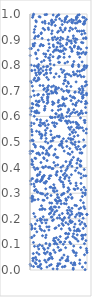
| Category | Series 0 |
|---|---|
| 0.001 | 0.865 |
| 0.002 | 0.464 |
| 0.003 | 0.022 |
| 0.004 | 0.838 |
| 0.005 | 0.455 |
| 0.006 | 0.632 |
| 0.007 | 0.348 |
| 0.008 | 0.607 |
| 0.009 | 0.504 |
| 0.01 | 0.737 |
| 0.011 | 0.465 |
| 0.012 | 0.677 |
| 0.013 | 0.016 |
| 0.014 | 0.178 |
| 0.015 | 0.281 |
| 0.016 | 0.564 |
| 0.017 | 0.335 |
| 0.018 | 0.8 |
| 0.019 | 0.632 |
| 0.02 | 0.127 |
| 0.021 | 0.575 |
| 0.022 | 0.62 |
| 0.023 | 0.733 |
| 0.024 | 0.865 |
| 0.025 | 0.413 |
| 0.026 | 0.78 |
| 0.027 | 0.16 |
| 0.028 | 0.548 |
| 0.029 | 0.356 |
| 0.03 | 0.43 |
| 0.031 | 0.172 |
| 0.032 | 0.779 |
| 0.033 | 0.268 |
| 0.034 | 0.127 |
| 0.035 | 0.54 |
| 0.036 | 0.527 |
| 0.037 | 0.164 |
| 0.038 | 0.65 |
| 0.039 | 0.289 |
| 0.04 | 0.508 |
| 0.041 | 0.718 |
| 0.042 | 0.278 |
| 0.043 | 0.634 |
| 0.044 | 0.424 |
| 0.045 | 0.987 |
| 0.046 | 0.357 |
| 0.047 | 0.412 |
| 0.048 | 0.464 |
| 0.049 | 0.045 |
| 0.05 | 0.286 |
| 0.051 | 0.036 |
| 0.052 | 0.648 |
| 0.053 | 0.883 |
| 0.054 | 0.993 |
| 0.055 | 0.505 |
| 0.056 | 0.274 |
| 0.057 | 0.875 |
| 0.058 | 0.064 |
| 0.059 | 0.7 |
| 0.06 | 0.107 |
| 0.061 | 0.014 |
| 0.062 | 0.877 |
| 0.063 | 0.999 |
| 0.064 | 0.045 |
| 0.065 | 0.221 |
| 0.066 | 0.491 |
| 0.067 | 0.743 |
| 0.068 | 0.336 |
| 0.069 | 0.401 |
| 0.07 | 0.572 |
| 0.071 | 0.875 |
| 0.072 | 0.928 |
| 0.073 | 0.134 |
| 0.074 | 0.798 |
| 0.075 | 0.601 |
| 0.076 | 0.682 |
| 0.077 | 0.326 |
| 0.078 | 0.939 |
| 0.079 | 0.092 |
| 0.08 | 0.31 |
| 0.081 | 0.905 |
| 0.082 | 0.749 |
| 0.083 | 0.619 |
| 0.084 | 0.885 |
| 0.085 | 0.274 |
| 0.086 | 0.781 |
| 0.087 | 0.437 |
| 0.088 | 0.161 |
| 0.089 | 0.208 |
| 0.09 | 0.616 |
| 0.091 | 0.029 |
| 0.092 | 0.392 |
| 0.093 | 0.485 |
| 0.094 | 0.48 |
| 0.095 | 0.18 |
| 0.096 | 0.951 |
| 0.097 | 0.913 |
| 0.098 | 0.049 |
| 0.099 | 0.848 |
| 0.1 | 0.436 |
| 0.101 | 0.769 |
| 0.102 | 0.844 |
| 0.103 | 0.974 |
| 0.104 | 0.315 |
| 0.105 | 0.348 |
| 0.106 | 0.738 |
| 0.107 | 0.66 |
| 0.108 | 0.024 |
| 0.109 | 0.345 |
| 0.11 | 0.614 |
| 0.111 | 0.969 |
| 0.112 | 0.645 |
| 0.113 | 0.761 |
| 0.114 | 0.04 |
| 0.115 | 0.542 |
| 0.116 | 0.796 |
| 0.117 | 0.646 |
| 0.118 | 0.622 |
| 0.119 | 0.455 |
| 0.12 | 0.149 |
| 0.121 | 0.068 |
| 0.122 | 0.588 |
| 0.123 | 0.826 |
| 0.124 | 0.353 |
| 0.125 | 0.615 |
| 0.126 | 0.305 |
| 0.127 | 0.398 |
| 0.128 | 0.193 |
| 0.129 | 0.305 |
| 0.13 | 0.369 |
| 0.131 | 0.347 |
| 0.132 | 0.644 |
| 0.133 | 0.74 |
| 0.134 | 0.684 |
| 0.135 | 0.092 |
| 0.136 | 0.372 |
| 0.137 | 0.395 |
| 0.138 | 0.013 |
| 0.139 | 0.304 |
| 0.14 | 0.79 |
| 0.141 | 0.912 |
| 0.142 | 0.657 |
| 0.143 | 0.276 |
| 0.144 | 0.859 |
| 0.145 | 0.796 |
| 0.146 | 0.458 |
| 0.147 | 0.75 |
| 0.148 | 0.915 |
| 0.149 | 0.686 |
| 0.15 | 0.772 |
| 0.151 | 0.803 |
| 0.152 | 0.454 |
| 0.153 | 0.641 |
| 0.154 | 0.082 |
| 0.155 | 0.657 |
| 0.156 | 0.614 |
| 0.157 | 0.781 |
| 0.158 | 0.061 |
| 0.159 | 0.012 |
| 0.16 | 0.745 |
| 0.161 | 0.99 |
| 0.162 | 0.539 |
| 0.163 | 0.66 |
| 0.164 | 0.566 |
| 0.165 | 0.373 |
| 0.166 | 0.566 |
| 0.167 | 0.035 |
| 0.168 | 0.765 |
| 0.169 | 0.098 |
| 0.17 | 0.171 |
| 0.171 | 0.53 |
| 0.172 | 0.45 |
| 0.173 | 0.017 |
| 0.174 | 0.236 |
| 0.175 | 0.721 |
| 0.176 | 0.875 |
| 0.177 | 0.382 |
| 0.178 | 0.988 |
| 0.179 | 0.346 |
| 0.18 | 0.201 |
| 0.181 | 0.161 |
| 0.182 | 0.3 |
| 0.183 | 0.577 |
| 0.184 | 0.193 |
| 0.185 | 0.586 |
| 0.186 | 0.564 |
| 0.187 | 0.022 |
| 0.188 | 0.771 |
| 0.189 | 0.197 |
| 0.19 | 0.482 |
| 0.191 | 0.787 |
| 0.192 | 0.42 |
| 0.193 | 0.349 |
| 0.194 | 0.881 |
| 0.195 | 0.923 |
| 0.196 | 0.515 |
| 0.197 | 0.006 |
| 0.198 | 0.53 |
| 0.199 | 0.927 |
| 0.2 | 0.35 |
| 0.201 | 0.251 |
| 0.202 | 0.813 |
| 0.203 | 0.197 |
| 0.204 | 0.522 |
| 0.205 | 0.298 |
| 0.206 | 0.155 |
| 0.207 | 0.673 |
| 0.208 | 0.185 |
| 0.209 | 0.356 |
| 0.21 | 0.353 |
| 0.211 | 0.237 |
| 0.212 | 0.527 |
| 0.213 | 0.905 |
| 0.214 | 0.666 |
| 0.215 | 0.094 |
| 0.216 | 0.363 |
| 0.217 | 0.359 |
| 0.218 | 0.968 |
| 0.219 | 0.572 |
| 0.22 | 0.134 |
| 0.221 | 0.402 |
| 0.222 | 0.457 |
| 0.223 | 0.24 |
| 0.224 | 0.298 |
| 0.225 | 0.877 |
| 0.226 | 0.778 |
| 0.227 | 0.48 |
| 0.228 | 0.273 |
| 0.229 | 0.72 |
| 0.23 | 0.944 |
| 0.231 | 0.208 |
| 0.232 | 0.571 |
| 0.233 | 0.877 |
| 0.234 | 0.364 |
| 0.235 | 0.684 |
| 0.236 | 0.794 |
| 0.237 | 0.4 |
| 0.238 | 0.657 |
| 0.239 | 0.085 |
| 0.24 | 0.475 |
| 0.241 | 0.439 |
| 0.242 | 0.845 |
| 0.243 | 0.705 |
| 0.244 | 0.369 |
| 0.245 | 0.272 |
| 0.246 | 0.818 |
| 0.247 | 0.435 |
| 0.248 | 0.341 |
| 0.249 | 0.369 |
| 0.25 | 0.762 |
| 0.251 | 0.067 |
| 0.252 | 0.574 |
| 0.253 | 0.153 |
| 0.254 | 0.624 |
| 0.255 | 0.08 |
| 0.256 | 0.709 |
| 0.257 | 0.938 |
| 0.258 | 0.195 |
| 0.259 | 0.038 |
| 0.26 | 0.63 |
| 0.261 | 0.972 |
| 0.262 | 0.237 |
| 0.263 | 0.639 |
| 0.264 | 0.997 |
| 0.265 | 0.964 |
| 0.266 | 0.527 |
| 0.267 | 0.339 |
| 0.268 | 0.564 |
| 0.269 | 0.291 |
| 0.27 | 0.063 |
| 0.271 | 0.546 |
| 0.272 | 0.502 |
| 0.273 | 0.834 |
| 0.274 | 0.127 |
| 0.275 | 0.405 |
| 0.276 | 0.317 |
| 0.277 | 0.843 |
| 0.278 | 0.535 |
| 0.279 | 0.453 |
| 0.28 | 0.184 |
| 0.281 | 0.104 |
| 0.282 | 0.346 |
| 0.283 | 0.136 |
| 0.284 | 0.514 |
| 0.285 | 0.031 |
| 0.286 | 0.782 |
| 0.287 | 0.77 |
| 0.288 | 0.697 |
| 0.289 | 0.345 |
| 0.29 | 0.466 |
| 0.291 | 0.767 |
| 0.292 | 0.998 |
| 0.293 | 0.794 |
| 0.294 | 0.752 |
| 0.295 | 0.583 |
| 0.296 | 0.168 |
| 0.297 | 0.195 |
| 0.298 | 0.011 |
| 0.299 | 0.427 |
| 0.3 | 0.651 |
| 0.301 | 0.458 |
| 0.302 | 0.554 |
| 0.303 | 0.282 |
| 0.304 | 0.07 |
| 0.305 | 0.297 |
| 0.306 | 0.712 |
| 0.307 | 0.671 |
| 0.308 | 0.664 |
| 0.309 | 0.687 |
| 0.31 | 0.677 |
| 0.311 | 0.795 |
| 0.312 | 0.704 |
| 0.313 | 0.704 |
| 0.314 | 0.496 |
| 0.315 | 0.656 |
| 0.316 | 0.675 |
| 0.317 | 0.085 |
| 0.318 | 0.857 |
| 0.319 | 0.04 |
| 0.32 | 0.946 |
| 0.321 | 0.568 |
| 0.322 | 0.898 |
| 0.323 | 0.744 |
| 0.324 | 0.401 |
| 0.325 | 0.719 |
| 0.326 | 0.829 |
| 0.327 | 0.939 |
| 0.328 | 0.358 |
| 0.329 | 0.451 |
| 0.33 | 0.448 |
| 0.331 | 0.963 |
| 0.332 | 0.156 |
| 0.333 | 0.883 |
| 0.334 | 0.169 |
| 0.335 | 0.475 |
| 0.336 | 0.688 |
| 0.337 | 0.357 |
| 0.338 | 0.044 |
| 0.339 | 0.219 |
| 0.34 | 0.045 |
| 0.341 | 0.829 |
| 0.342 | 0.869 |
| 0.343 | 0.017 |
| 0.344 | 0.367 |
| 0.345 | 0.095 |
| 0.346 | 0.101 |
| 0.347 | 0.262 |
| 0.348 | 0.239 |
| 0.349 | 0.402 |
| 0.35 | 0.819 |
| 0.351 | 0.782 |
| 0.352 | 0.323 |
| 0.353 | 0.06 |
| 0.354 | 0.481 |
| 0.355 | 0.065 |
| 0.356 | 0.805 |
| 0.357 | 0.841 |
| 0.358 | 0.598 |
| 0.359 | 0.064 |
| 0.36 | 0.241 |
| 0.361 | 0.223 |
| 0.362 | 0.77 |
| 0.363 | 0.543 |
| 0.364 | 0.787 |
| 0.365 | 0.324 |
| 0.366 | 0.368 |
| 0.367 | 0.503 |
| 0.368 | 0.595 |
| 0.369 | 0.291 |
| 0.37 | 0.528 |
| 0.371 | 0.246 |
| 0.372 | 0.021 |
| 0.373 | 0.207 |
| 0.374 | 0.973 |
| 0.375 | 0.698 |
| 0.376 | 0.484 |
| 0.377 | 0.051 |
| 0.378 | 0.715 |
| 0.379 | 0.958 |
| 0.38 | 0.923 |
| 0.381 | 0.261 |
| 0.382 | 0.976 |
| 0.383 | 0.231 |
| 0.384 | 0.691 |
| 0.385 | 0.396 |
| 0.386 | 0.966 |
| 0.387 | 0.965 |
| 0.388 | 0.207 |
| 0.389 | 0.934 |
| 0.39 | 0.623 |
| 0.391 | 0.045 |
| 0.392 | 0.595 |
| 0.393 | 0.906 |
| 0.394 | 0.193 |
| 0.395 | 0.575 |
| 0.396 | 0.657 |
| 0.397 | 0.236 |
| 0.398 | 0.646 |
| 0.399 | 0.516 |
| 0.4 | 0.506 |
| 0.401 | 0.899 |
| 0.402 | 0.319 |
| 0.403 | 0.396 |
| 0.404 | 0.833 |
| 0.405 | 0.004 |
| 0.406 | 0.692 |
| 0.407 | 0.996 |
| 0.408 | 0.879 |
| 0.409 | 0.852 |
| 0.41 | 0.309 |
| 0.411 | 0.196 |
| 0.412 | 0.116 |
| 0.413 | 0.719 |
| 0.414 | 0.873 |
| 0.415 | 0.969 |
| 0.416 | 0.078 |
| 0.417 | 0.449 |
| 0.418 | 0.333 |
| 0.419 | 0.42 |
| 0.42 | 0.217 |
| 0.421 | 0.651 |
| 0.422 | 0.124 |
| 0.423 | 0.801 |
| 0.424 | 0.753 |
| 0.425 | 0.247 |
| 0.426 | 0.564 |
| 0.427 | 0.103 |
| 0.428 | 0.575 |
| 0.429 | 0.306 |
| 0.43 | 0.518 |
| 0.431 | 0.859 |
| 0.432 | 0.322 |
| 0.433 | 0.91 |
| 0.434 | 0.452 |
| 0.435 | 0.226 |
| 0.436 | 0.319 |
| 0.437 | 0.113 |
| 0.438 | 0.162 |
| 0.439 | 0.56 |
| 0.44 | 0.596 |
| 0.441 | 0.069 |
| 0.442 | 0.698 |
| 0.443 | 0.955 |
| 0.444 | 0.274 |
| 0.445 | 0.471 |
| 0.446 | 0.408 |
| 0.447 | 0.706 |
| 0.448 | 0.246 |
| 0.449 | 0.105 |
| 0.45 | 0.977 |
| 0.451 | 0.694 |
| 0.452 | 0.611 |
| 0.453 | 0.714 |
| 0.454 | 0.271 |
| 0.455 | 0.858 |
| 0.456 | 0.165 |
| 0.457 | 0.766 |
| 0.458 | 0.373 |
| 0.459 | 0.861 |
| 0.46 | 0.609 |
| 0.461 | 0.126 |
| 0.462 | 0.9 |
| 0.463 | 0.441 |
| 0.464 | 0.988 |
| 0.465 | 0.706 |
| 0.466 | 0.269 |
| 0.467 | 0.37 |
| 0.468 | 0.572 |
| 0.469 | 0.691 |
| 0.47 | 0.232 |
| 0.471 | 0.382 |
| 0.472 | 0.309 |
| 0.473 | 0.87 |
| 0.474 | 0.101 |
| 0.475 | 0.523 |
| 0.476 | 0.26 |
| 0.477 | 0.004 |
| 0.478 | 0.384 |
| 0.479 | 0.015 |
| 0.48 | 0.203 |
| 0.481 | 0.294 |
| 0.482 | 0.283 |
| 0.483 | 0.994 |
| 0.484 | 0.928 |
| 0.485 | 0.888 |
| 0.486 | 0.906 |
| 0.487 | 0.411 |
| 0.488 | 0.439 |
| 0.489 | 0.018 |
| 0.49 | 0.598 |
| 0.491 | 0.025 |
| 0.492 | 0.827 |
| 0.493 | 0.089 |
| 0.494 | 0.655 |
| 0.495 | 0.887 |
| 0.496 | 0.858 |
| 0.497 | 0.624 |
| 0.498 | 0.118 |
| 0.499 | 0.639 |
| 0.5 | 0.932 |
| 0.501 | 0.711 |
| 0.502 | 0.811 |
| 0.503 | 0.662 |
| 0.504 | 0.269 |
| 0.505 | 0.283 |
| 0.506 | 0.997 |
| 0.507 | 0.174 |
| 0.508 | 0.245 |
| 0.509 | 0.834 |
| 0.51 | 0.603 |
| 0.511 | 0.52 |
| 0.512 | 0.523 |
| 0.513 | 0.756 |
| 0.514 | 0.487 |
| 0.515 | 0.214 |
| 0.516 | 0.076 |
| 0.517 | 0.586 |
| 0.518 | 0.811 |
| 0.519 | 0.353 |
| 0.52 | 0.981 |
| 0.521 | 0.203 |
| 0.522 | 0.272 |
| 0.523 | 0.833 |
| 0.524 | 0.025 |
| 0.525 | 0.854 |
| 0.526 | 0.643 |
| 0.527 | 0.109 |
| 0.528 | 0.898 |
| 0.529 | 0.039 |
| 0.53 | 0.131 |
| 0.531 | 0.946 |
| 0.532 | 0.361 |
| 0.533 | 0.884 |
| 0.534 | 0.873 |
| 0.535 | 0.856 |
| 0.536 | 0.492 |
| 0.537 | 0.628 |
| 0.538 | 0.27 |
| 0.539 | 0.908 |
| 0.54 | 0.109 |
| 0.541 | 0.079 |
| 0.542 | 0.595 |
| 0.543 | 0.937 |
| 0.544 | 0.401 |
| 0.545 | 0.346 |
| 0.546 | 0.583 |
| 0.547 | 0.259 |
| 0.548 | 0.784 |
| 0.549 | 0.387 |
| 0.55 | 0.161 |
| 0.551 | 0.486 |
| 0.552 | 0.854 |
| 0.553 | 0.293 |
| 0.554 | 0.706 |
| 0.555 | 0.503 |
| 0.556 | 0.609 |
| 0.557 | 0.973 |
| 0.558 | 0.502 |
| 0.559 | 0.047 |
| 0.56 | 0.197 |
| 0.561 | 0.494 |
| 0.562 | 0.603 |
| 0.563 | 0.181 |
| 0.564 | 0.642 |
| 0.565 | 0.959 |
| 0.566 | 0.047 |
| 0.567 | 0.221 |
| 0.568 | 0.012 |
| 0.569 | 0.772 |
| 0.57 | 0.296 |
| 0.571 | 0.876 |
| 0.572 | 0.67 |
| 0.573 | 0.343 |
| 0.574 | 0.478 |
| 0.575 | 0.904 |
| 0.576 | 0.676 |
| 0.577 | 0.93 |
| 0.578 | 0.193 |
| 0.579 | 0.407 |
| 0.58 | 0.857 |
| 0.581 | 0.645 |
| 0.582 | 0.594 |
| 0.583 | 0.372 |
| 0.584 | 0.101 |
| 0.585 | 0.175 |
| 0.586 | 0.513 |
| 0.587 | 0.333 |
| 0.588 | 0.298 |
| 0.589 | 0.728 |
| 0.59 | 0.699 |
| 0.591 | 0.325 |
| 0.592 | 0.65 |
| 0.593 | 0.668 |
| 0.594 | 0.3 |
| 0.595 | 0.779 |
| 0.596 | 0.058 |
| 0.597 | 0.831 |
| 0.598 | 0.845 |
| 0.599 | 0.202 |
| 0.6 | 0.465 |
| 0.601 | 0.866 |
| 0.602 | 0.26 |
| 0.603 | 0.013 |
| 0.604 | 0.667 |
| 0.605 | 0.74 |
| 0.606 | 0.205 |
| 0.607 | 0.969 |
| 0.608 | 0.357 |
| 0.609 | 0.739 |
| 0.61 | 0.11 |
| 0.611 | 0.377 |
| 0.612 | 0.938 |
| 0.613 | 0.977 |
| 0.614 | 0.808 |
| 0.615 | 0.015 |
| 0.616 | 0.641 |
| 0.617 | 0.364 |
| 0.618 | 0.753 |
| 0.619 | 0.763 |
| 0.62 | 0.74 |
| 0.621 | 0.944 |
| 0.622 | 0.985 |
| 0.623 | 0.582 |
| 0.624 | 0.142 |
| 0.625 | 0.087 |
| 0.626 | 0.862 |
| 0.627 | 0.981 |
| 0.628 | 0.278 |
| 0.629 | 0.389 |
| 0.63 | 0.185 |
| 0.631 | 0.423 |
| 0.632 | 0.123 |
| 0.633 | 0.144 |
| 0.634 | 0.036 |
| 0.635 | 0.272 |
| 0.636 | 0.258 |
| 0.637 | 0.037 |
| 0.638 | 0.274 |
| 0.639 | 0.67 |
| 0.64 | 0.503 |
| 0.641 | 0.881 |
| 0.642 | 0.6 |
| 0.643 | 0.581 |
| 0.644 | 0.717 |
| 0.645 | 0.369 |
| 0.646 | 0.701 |
| 0.647 | 0.887 |
| 0.648 | 0.483 |
| 0.649 | 0.99 |
| 0.65 | 0.766 |
| 0.651 | 0.578 |
| 0.652 | 0.9 |
| 0.653 | 0.396 |
| 0.654 | 0.573 |
| 0.655 | 0.233 |
| 0.656 | 0.968 |
| 0.657 | 0.616 |
| 0.658 | 0.043 |
| 0.659 | 0.813 |
| 0.66 | 0.221 |
| 0.661 | 0.306 |
| 0.662 | 0.128 |
| 0.663 | 0.405 |
| 0.664 | 0.052 |
| 0.665 | 0.734 |
| 0.666 | 0.91 |
| 0.667 | 0.036 |
| 0.668 | 0.455 |
| 0.669 | 0.222 |
| 0.67 | 0.321 |
| 0.671 | 0.14 |
| 0.672 | 0.179 |
| 0.673 | 0.285 |
| 0.674 | 0.695 |
| 0.675 | 0.729 |
| 0.676 | 0.514 |
| 0.677 | 0.628 |
| 0.678 | 0.556 |
| 0.679 | 0.142 |
| 0.68 | 0.244 |
| 0.681 | 0.623 |
| 0.682 | 0.583 |
| 0.683 | 0.205 |
| 0.684 | 0.7 |
| 0.685 | 0.763 |
| 0.686 | 0.361 |
| 0.687 | 0.349 |
| 0.688 | 0.894 |
| 0.689 | 0.314 |
| 0.69 | 0.162 |
| 0.691 | 0.974 |
| 0.692 | 0.601 |
| 0.693 | 0.934 |
| 0.694 | 0.833 |
| 0.695 | 0.412 |
| 0.696 | 0.234 |
| 0.697 | 0.109 |
| 0.698 | 0.474 |
| 0.699 | 0.529 |
| 0.7 | 0.452 |
| 0.701 | 0.549 |
| 0.702 | 0.19 |
| 0.703 | 0.214 |
| 0.704 | 0.423 |
| 0.705 | 0.87 |
| 0.706 | 0.155 |
| 0.707 | 0.68 |
| 0.708 | 0.193 |
| 0.709 | 0.946 |
| 0.71 | 0.418 |
| 0.711 | 0.338 |
| 0.712 | 0.295 |
| 0.713 | 0.576 |
| 0.714 | 0.61 |
| 0.715 | 0.509 |
| 0.716 | 0.103 |
| 0.717 | 0.513 |
| 0.718 | 0.717 |
| 0.719 | 0.185 |
| 0.72 | 0.758 |
| 0.721 | 0.662 |
| 0.722 | 0.028 |
| 0.723 | 0.895 |
| 0.724 | 0.497 |
| 0.725 | 0.558 |
| 0.726 | 0.372 |
| 0.727 | 0.886 |
| 0.728 | 0.228 |
| 0.729 | 0.978 |
| 0.73 | 0.43 |
| 0.731 | 0.863 |
| 0.732 | 0.968 |
| 0.733 | 0.854 |
| 0.734 | 0.28 |
| 0.735 | 0.218 |
| 0.736 | 0.405 |
| 0.737 | 0.283 |
| 0.738 | 0.241 |
| 0.739 | 0.54 |
| 0.74 | 0.855 |
| 0.741 | 0.461 |
| 0.742 | 0.797 |
| 0.743 | 0.189 |
| 0.744 | 0.966 |
| 0.745 | 0.674 |
| 0.746 | 0.941 |
| 0.747 | 0.616 |
| 0.748 | 0.795 |
| 0.749 | 0.536 |
| 0.75 | 0.492 |
| 0.751 | 0.131 |
| 0.752 | 0.648 |
| 0.753 | 0.511 |
| 0.754 | 0.803 |
| 0.755 | 0.076 |
| 0.756 | 0.02 |
| 0.757 | 0.578 |
| 0.758 | 0.003 |
| 0.759 | 0.007 |
| 0.76 | 0.773 |
| 0.761 | 0.915 |
| 0.762 | 0.44 |
| 0.763 | 0.905 |
| 0.764 | 0.141 |
| 0.765 | 0.975 |
| 0.766 | 0.675 |
| 0.767 | 0.093 |
| 0.768 | 0.763 |
| 0.769 | 0.547 |
| 0.77 | 0.814 |
| 0.771 | 0.627 |
| 0.772 | 0.317 |
| 0.773 | 0.07 |
| 0.774 | 0.069 |
| 0.775 | 0.168 |
| 0.776 | 0.522 |
| 0.777 | 0.871 |
| 0.778 | 0.154 |
| 0.779 | 0.028 |
| 0.78 | 0.763 |
| 0.781 | 0.026 |
| 0.782 | 0.876 |
| 0.783 | 0.126 |
| 0.784 | 0.671 |
| 0.785 | 0.894 |
| 0.786 | 0.694 |
| 0.787 | 0.49 |
| 0.788 | 0.253 |
| 0.789 | 0.02 |
| 0.79 | 0.314 |
| 0.791 | 0.179 |
| 0.792 | 0.5 |
| 0.793 | 0.614 |
| 0.794 | 0.695 |
| 0.795 | 0.964 |
| 0.796 | 0.208 |
| 0.797 | 0.388 |
| 0.798 | 0.646 |
| 0.799 | 0.538 |
| 0.8 | 0.944 |
| 0.801 | 0.903 |
| 0.802 | 0.889 |
| 0.803 | 0.643 |
| 0.804 | 0.056 |
| 0.805 | 0.479 |
| 0.806 | 0.765 |
| 0.807 | 0.577 |
| 0.808 | 0.34 |
| 0.809 | 0.735 |
| 0.81 | 0.979 |
| 0.811 | 0.329 |
| 0.812 | 0.985 |
| 0.813 | 0.067 |
| 0.814 | 0.121 |
| 0.815 | 0.251 |
| 0.816 | 0.653 |
| 0.817 | 0.988 |
| 0.818 | 0.152 |
| 0.819 | 0.556 |
| 0.82 | 0.57 |
| 0.821 | 0.217 |
| 0.822 | 0.417 |
| 0.823 | 0.901 |
| 0.824 | 0.965 |
| 0.825 | 0.398 |
| 0.826 | 0.618 |
| 0.827 | 0.573 |
| 0.828 | 0.471 |
| 0.829 | 0.137 |
| 0.83 | 0.934 |
| 0.831 | 0.986 |
| 0.832 | 0.158 |
| 0.833 | 0.777 |
| 0.834 | 0.557 |
| 0.835 | 0.849 |
| 0.836 | 0.429 |
| 0.837 | 0.758 |
| 0.838 | 0.319 |
| 0.839 | 0.995 |
| 0.84 | 0.865 |
| 0.841 | 0.525 |
| 0.842 | 0.843 |
| 0.843 | 0.113 |
| 0.844 | 0.97 |
| 0.845 | 0.434 |
| 0.846 | 0.16 |
| 0.847 | 0.872 |
| 0.848 | 0.154 |
| 0.849 | 0.483 |
| 0.85 | 0.606 |
| 0.851 | 0.566 |
| 0.852 | 0.661 |
| 0.853 | 0.801 |
| 0.854 | 0.38 |
| 0.855 | 0.795 |
| 0.856 | 0.554 |
| 0.857 | 0.222 |
| 0.858 | 0.867 |
| 0.859 | 0.501 |
| 0.86 | 0.694 |
| 0.861 | 0.238 |
| 0.862 | 0.847 |
| 0.863 | 0.997 |
| 0.864 | 0.708 |
| 0.865 | 0.192 |
| 0.866 | 0.933 |
| 0.867 | 0.61 |
| 0.868 | 0.973 |
| 0.869 | 0.153 |
| 0.87 | 0.776 |
| 0.871 | 0.025 |
| 0.872 | 0.831 |
| 0.873 | 0.211 |
| 0.874 | 0.039 |
| 0.875 | 0.411 |
| 0.876 | 0.762 |
| 0.877 | 0.457 |
| 0.878 | 0.704 |
| 0.879 | 0.557 |
| 0.88 | 0.178 |
| 0.881 | 0.971 |
| 0.882 | 0.472 |
| 0.883 | 0.406 |
| 0.884 | 0.22 |
| 0.885 | 0.425 |
| 0.886 | 0.594 |
| 0.887 | 0.612 |
| 0.888 | 0.088 |
| 0.889 | 0.272 |
| 0.89 | 0.243 |
| 0.891 | 0.426 |
| 0.892 | 0.863 |
| 0.893 | 0.375 |
| 0.894 | 0.338 |
| 0.895 | 0.406 |
| 0.896 | 0.22 |
| 0.897 | 0.36 |
| 0.898 | 0.689 |
| 0.899 | 0.657 |
| 0.9 | 0.313 |
| 0.901 | 0.621 |
| 0.902 | 0.755 |
| 0.903 | 0.846 |
| 0.904 | 0.889 |
| 0.905 | 0.457 |
| 0.906 | 0.135 |
| 0.907 | 0.934 |
| 0.908 | 0.921 |
| 0.909 | 0.779 |
| 0.91 | 0.186 |
| 0.911 | 0.457 |
| 0.912 | 0.717 |
| 0.913 | 0.136 |
| 0.914 | 0.813 |
| 0.915 | 0.218 |
| 0.916 | 0.121 |
| 0.917 | 0.555 |
| 0.918 | 0.287 |
| 0.919 | 0.694 |
| 0.92 | 0.011 |
| 0.921 | 0.678 |
| 0.922 | 0.612 |
| 0.923 | 0.671 |
| 0.924 | 0.709 |
| 0.925 | 0.987 |
| 0.926 | 0.124 |
| 0.927 | 0.302 |
| 0.928 | 0.888 |
| 0.929 | 0.783 |
| 0.93 | 0.702 |
| 0.931 | 0.674 |
| 0.932 | 0.135 |
| 0.933 | 0.202 |
| 0.934 | 0.962 |
| 0.935 | 0.162 |
| 0.936 | 0.851 |
| 0.937 | 0.262 |
| 0.938 | 0.905 |
| 0.939 | 0.683 |
| 0.94 | 0.544 |
| 0.941 | 0.508 |
| 0.942 | 0.481 |
| 0.943 | 0.368 |
| 0.944 | 0.934 |
| 0.945 | 0.755 |
| 0.946 | 0.247 |
| 0.947 | 0.96 |
| 0.948 | 0.323 |
| 0.949 | 0.794 |
| 0.95 | 0.783 |
| 0.951 | 0.584 |
| 0.952 | 0.392 |
| 0.953 | 0.986 |
| 0.954 | 0.969 |
| 0.955 | 0.103 |
| 0.956 | 0.059 |
| 0.957 | 0.798 |
| 0.958 | 0.964 |
| 0.959 | 0.18 |
| 0.96 | 0.972 |
| 0.961 | 0.24 |
| 0.962 | 0.575 |
| 0.963 | 0.925 |
| 0.964 | 0.584 |
| 0.965 | 0.718 |
| 0.966 | 0.486 |
| 0.967 | 0.001 |
| 0.968 | 0.294 |
| 0.969 | 0.301 |
| 0.97 | 0.843 |
| 0.971 | 0.138 |
| 0.972 | 0.649 |
| 0.973 | 0.028 |
| 0.974 | 0.635 |
| 0.975 | 0.735 |
| 0.976 | 0.312 |
| 0.977 | 0.172 |
| 0.978 | 0.659 |
| 0.979 | 0.908 |
| 0.98 | 0.368 |
| 0.981 | 0.115 |
| 0.982 | 0.904 |
| 0.983 | 0.614 |
| 0.984 | 0.849 |
| 0.985 | 0.735 |
| 0.986 | 0.79 |
| 0.987 | 0.535 |
| 0.988 | 0.979 |
| 0.989 | 0.551 |
| 0.99 | 0.084 |
| 0.991 | 0.69 |
| 0.992 | 0.684 |
| 0.993 | 0.868 |
| 0.994 | 0.724 |
| 0.995 | 0.075 |
| 0.996 | 0.217 |
| 0.997 | 0.651 |
| 0.998 | 0.798 |
| 0.999 | 0.217 |
| 1.0 | 0.068 |